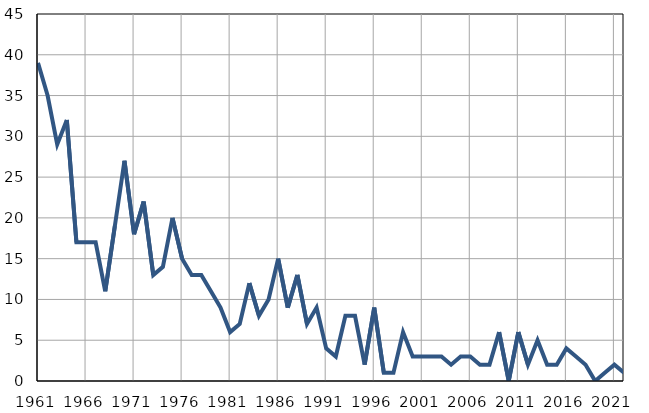
| Category | Infants
deaths |
|---|---|
| 1961.0 | 39 |
| 1962.0 | 35 |
| 1963.0 | 29 |
| 1964.0 | 32 |
| 1965.0 | 17 |
| 1966.0 | 17 |
| 1967.0 | 17 |
| 1968.0 | 11 |
| 1969.0 | 19 |
| 1970.0 | 27 |
| 1971.0 | 18 |
| 1972.0 | 22 |
| 1973.0 | 13 |
| 1974.0 | 14 |
| 1975.0 | 20 |
| 1976.0 | 15 |
| 1977.0 | 13 |
| 1978.0 | 13 |
| 1979.0 | 11 |
| 1980.0 | 9 |
| 1981.0 | 6 |
| 1982.0 | 7 |
| 1983.0 | 12 |
| 1984.0 | 8 |
| 1985.0 | 10 |
| 1986.0 | 15 |
| 1987.0 | 9 |
| 1988.0 | 13 |
| 1989.0 | 7 |
| 1990.0 | 9 |
| 1991.0 | 4 |
| 1992.0 | 3 |
| 1993.0 | 8 |
| 1994.0 | 8 |
| 1995.0 | 2 |
| 1996.0 | 9 |
| 1997.0 | 1 |
| 1998.0 | 1 |
| 1999.0 | 6 |
| 2000.0 | 3 |
| 2001.0 | 3 |
| 2002.0 | 3 |
| 2003.0 | 3 |
| 2004.0 | 2 |
| 2005.0 | 3 |
| 2006.0 | 3 |
| 2007.0 | 2 |
| 2008.0 | 2 |
| 2009.0 | 6 |
| 2010.0 | 0 |
| 2011.0 | 6 |
| 2012.0 | 2 |
| 2013.0 | 5 |
| 2014.0 | 2 |
| 2015.0 | 2 |
| 2016.0 | 4 |
| 2017.0 | 3 |
| 2018.0 | 2 |
| 2019.0 | 0 |
| 2020.0 | 1 |
| 2021.0 | 2 |
| 2022.0 | 1 |